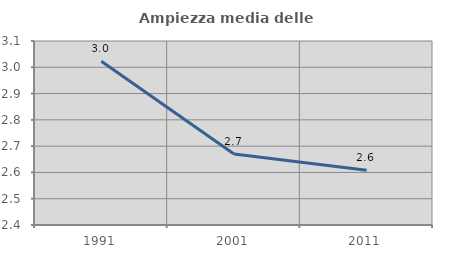
| Category | Ampiezza media delle famiglie |
|---|---|
| 1991.0 | 3.023 |
| 2001.0 | 2.67 |
| 2011.0 | 2.608 |